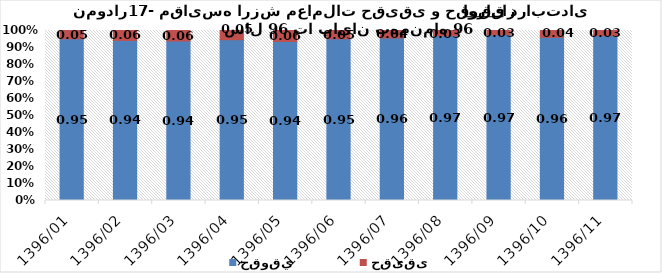
| Category | حقوقي | حقیقی |
|---|---|---|
| 1396/01 | 0.951 | 0.049 |
| 1396/02 | 0.942 | 0.058 |
| 1396/03 | 0.938 | 0.062 |
| 1396/04 | 0.946 | 0.054 |
| 1396/05 | 0.936 | 0.064 |
| 1396/06 | 0.951 | 0.049 |
| 1396/07 | 0.956 | 0.044 |
| 1396/08 | 0.969 | 0.031 |
| 1396/09 | 0.975 | 0.025 |
| 1396/10 | 0.96 | 0.04 |
| 1396/11 | 0.97 | 0.03 |